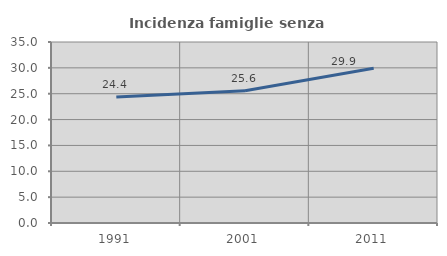
| Category | Incidenza famiglie senza nuclei |
|---|---|
| 1991.0 | 24.371 |
| 2001.0 | 25.591 |
| 2011.0 | 29.922 |